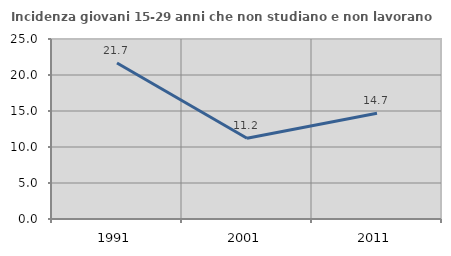
| Category | Incidenza giovani 15-29 anni che non studiano e non lavorano  |
|---|---|
| 1991.0 | 21.677 |
| 2001.0 | 11.221 |
| 2011.0 | 14.697 |